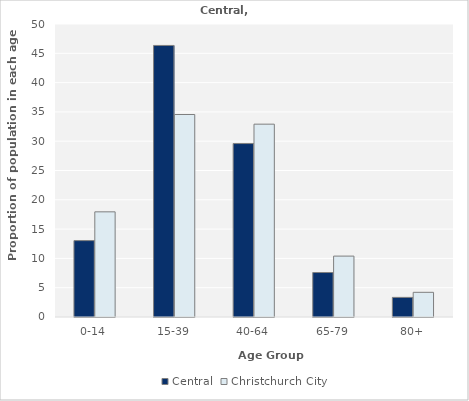
| Category | Central | Christchurch City |
|---|---|---|
| 0-14 | 13.036 | 17.945 |
| 15-39 | 46.339 | 34.556 |
| 40-64 | 29.598 | 32.907 |
| 65-79 | 7.589 | 10.392 |
| 80+ | 3.348 | 4.211 |